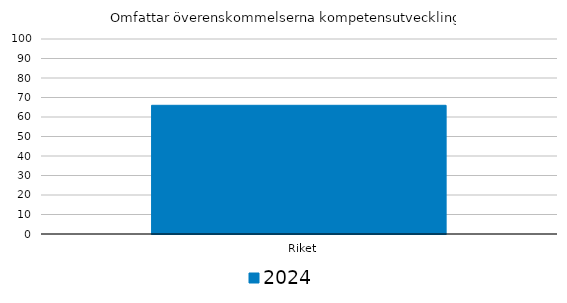
| Category | 2024 |
|---|---|
|   Riket | 66 |